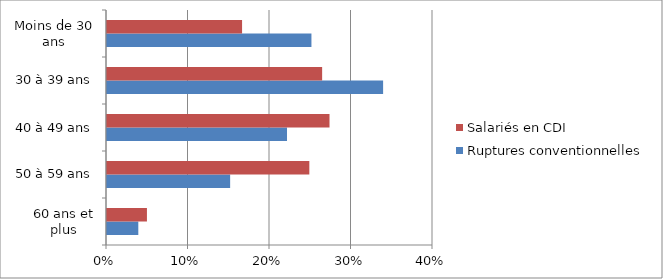
| Category | Ruptures conventionnelles | Salariés en CDI |
|---|---|---|
| 60 ans et plus | 0.038 | 0.049 |
| 50 à 59 ans | 0.151 | 0.248 |
| 40 à 49 ans | 0.221 | 0.273 |
| 30 à 39 ans | 0.339 | 0.264 |
| Moins de 30 ans | 0.251 | 0.166 |